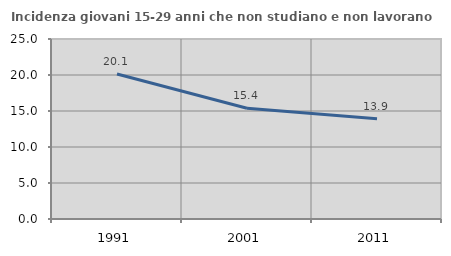
| Category | Incidenza giovani 15-29 anni che non studiano e non lavorano  |
|---|---|
| 1991.0 | 20.141 |
| 2001.0 | 15.385 |
| 2011.0 | 13.924 |